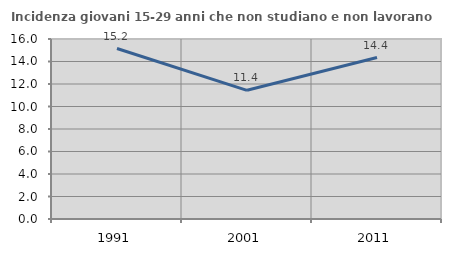
| Category | Incidenza giovani 15-29 anni che non studiano e non lavorano  |
|---|---|
| 1991.0 | 15.151 |
| 2001.0 | 11.438 |
| 2011.0 | 14.352 |